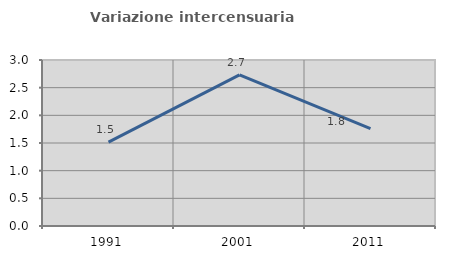
| Category | Variazione intercensuaria annua |
|---|---|
| 1991.0 | 1.516 |
| 2001.0 | 2.732 |
| 2011.0 | 1.761 |